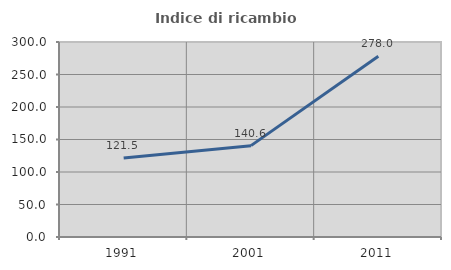
| Category | Indice di ricambio occupazionale  |
|---|---|
| 1991.0 | 121.538 |
| 2001.0 | 140.566 |
| 2011.0 | 278.049 |